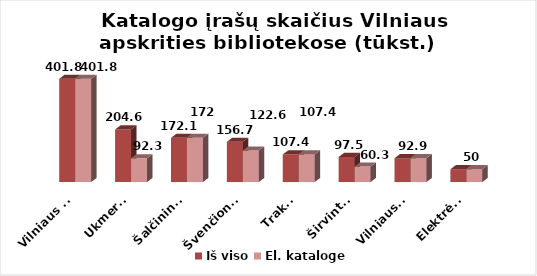
| Category | Iš viso | El. kataloge |
|---|---|---|
| Vilniaus m. | 401.8 | 401.8 |
| Ukmergė | 204.6 | 92.3 |
| Šalčininkai | 172.1 | 172.1 |
| Švenčionys | 156.7 | 122.6 |
| Trakai | 107.4 | 107.4 |
| Širvintos | 97.5 | 60.3 |
| Vilniaus r. | 92.9 | 92.9 |
| Elektrėnai | 50 | 50 |